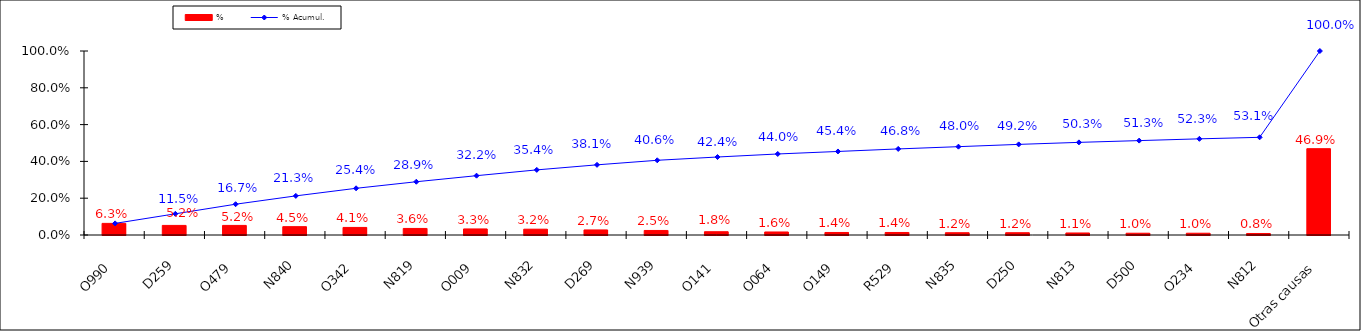
| Category | % |
|---|---|
| O990 | 0.063 |
| D259 | 0.052 |
| O479 | 0.052 |
| N840 | 0.045 |
| O342 | 0.041 |
| N819 | 0.036 |
| O009 | 0.033 |
| N832 | 0.032 |
| D269 | 0.027 |
| N939 | 0.025 |
| O141 | 0.018 |
| O064 | 0.016 |
| O149 | 0.014 |
| R529 | 0.014 |
| N835 | 0.012 |
| D250 | 0.012 |
| N813 | 0.011 |
| D500 | 0.01 |
| O234 | 0.01 |
| N812 | 0.008 |
| Otras causas | 0.469 |